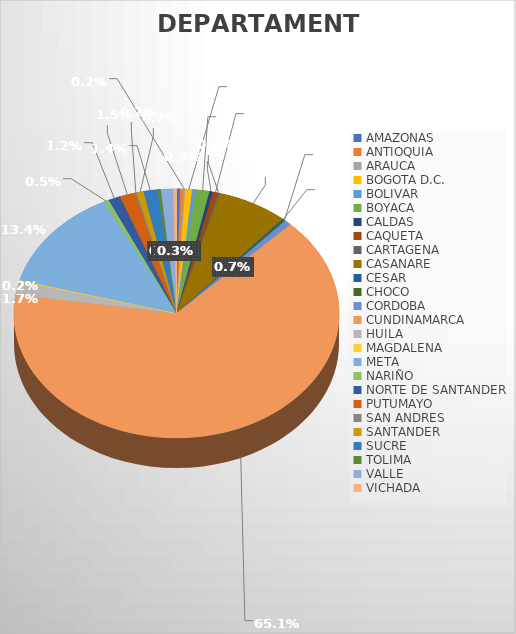
| Category | CANTIDAD |
|---|---|
| AMAZONAS | 2 |
| ANTIOQUIA | 2 |
| ARAUCA | 1 |
| BOGOTA D.C. | 4 |
| BOLIVAR | 2 |
| BOYACA | 8 |
| CALDAS | 2 |
| CAQUETA  | 3 |
| CARTAGENA | 1 |
| CASANARE | 41 |
| CESAR | 1 |
| CHOCO | 1 |
| CORDOBA | 4 |
| CUNDINAMARCA | 380 |
| HUILA | 10 |
| MAGDALENA | 1 |
| META | 78 |
| NARIÑO | 3 |
| NORTE DE SANTANDER | 7 |
| PUTUMAYO | 9 |
| SAN ANDRES | 1 |
| SANTANDER | 4 |
| SUCRE | 8 |
| TOLIMA | 2 |
| VALLE | 7 |
| VICHADA | 2 |